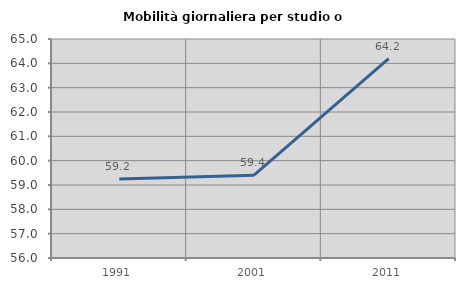
| Category | Mobilità giornaliera per studio o lavoro |
|---|---|
| 1991.0 | 59.248 |
| 2001.0 | 59.405 |
| 2011.0 | 64.198 |